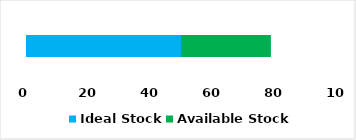
| Category | Sun Flower Oil | Ideal Stock | Available Stock |
|---|---|---|---|
| 0 |  | 50 | 29 |